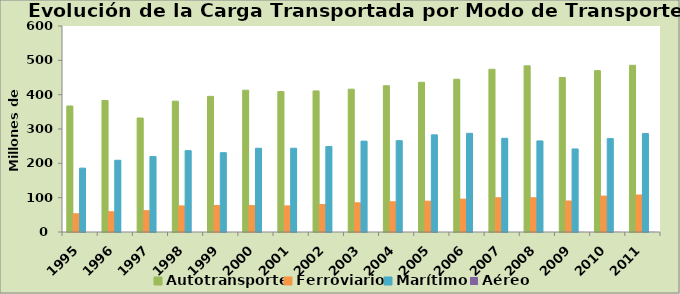
| Category | Autotransporte | Ferroviario | Marítimo | Aéreo |
|---|---|---|---|---|
| 1995.0 | 367 | 53 | 186 | 0 |
| 1996.0 | 383 | 59 | 209 | 0 |
| 1997.0 | 332 | 62 | 220 | 0 |
| 1998.0 | 381 | 76 | 237 | 0 |
| 1999.0 | 395 | 77 | 231 | 0 |
| 2000.0 | 413 | 77 | 244 | 0 |
| 2001.0 | 409 | 76 | 244 | 0 |
| 2002.0 | 411 | 80 | 249 | 0 |
| 2003.0 | 416 | 85 | 264.7 | 0 |
| 2004.0 | 426 | 88 | 266 | 0 |
| 2005.0 | 436 | 89.814 | 283 | 0 |
| 2006.0 | 445 | 95.713 | 287.4 | 0 |
| 2007.0 | 474 | 99.845 | 272.934 | 0 |
| 2008.0 | 484 | 99.692 | 265.237 | 0 |
| 2009.0 | 450 | 90.321 | 241.923 | 0.4 |
| 2010.0 | 470 | 104.564 | 272.015 | 0.571 |
| 2011.0 | 485.502 | 107.69 | 286.976 | 0.568 |